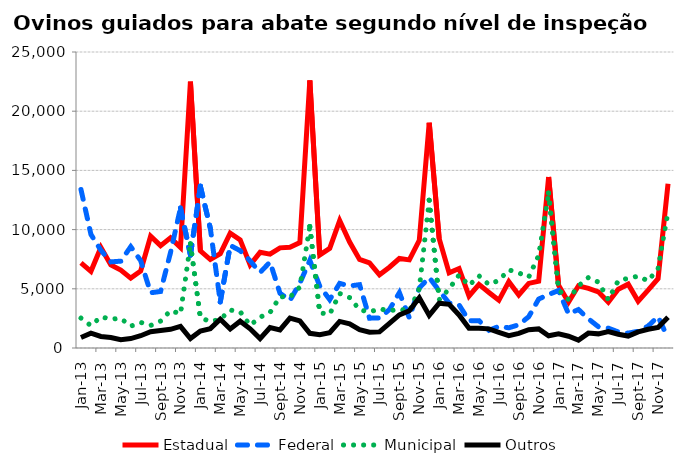
| Category | Estadual | Federal | Municipal | Outros |
|---|---|---|---|---|
| 2013-01-01 | 7184 | 13390 | 2529 | 890 |
| 2013-02-01 | 6476 | 9593 | 1889 | 1252 |
| 2013-03-01 | 8493 | 8261 | 2633 | 978 |
| 2013-04-01 | 7014 | 7273 | 2441 | 892 |
| 2013-05-01 | 6576 | 7335 | 2502 | 700 |
| 2013-06-01 | 5902 | 8555 | 1839 | 796 |
| 2013-07-01 | 6508 | 7380 | 2164 | 1036 |
| 2013-08-01 | 9440 | 4661 | 1903 | 1374 |
| 2013-09-01 | 8647 | 4775 | 2274 | 1475 |
| 2013-10-01 | 9303 | 8063 | 3164 | 1575 |
| 2013-11-01 | 8496 | 11823 | 2880 | 1831 |
| 2013-12-01 | 22506 | 7849 | 8800 | 800 |
| 2014-01-01 | 8208 | 13667 | 2560 | 1438 |
| 2014-02-01 | 7473 | 10109 | 2230 | 1631 |
| 2014-03-01 | 7964 | 3888 | 2426 | 2427 |
| 2014-04-01 | 9704 | 8668 | 3202 | 1611 |
| 2014-05-01 | 9137 | 8220 | 3061 | 2260 |
| 2014-06-01 | 7024 | 7359 | 1918 | 1622 |
| 2014-07-01 | 8079 | 6379 | 2601 | 797 |
| 2014-08-01 | 7920 | 7259 | 3000 | 1733 |
| 2014-09-01 | 8459 | 4626 | 4334 | 1525 |
| 2014-10-01 | 8514 | 4018 | 4295 | 2531 |
| 2014-11-01 | 8910 | 5478 | 5153 | 2283 |
| 2014-12-01 | 22595 | 7406 | 10265 | 1241 |
| 2015-01-01 | 7862 | 5220 | 2960 | 1123 |
| 2015-02-01 | 8423 | 4083 | 2860 | 1289 |
| 2015-03-01 | 10763 | 5457 | 4605 | 2244 |
| 2015-04-01 | 8946 | 5240 | 4257 | 2046 |
| 2015-05-01 | 7475 | 5349 | 3230 | 1552 |
| 2015-06-01 | 7196 | 2520 | 3038 | 1337 |
| 2015-07-01 | 6179 | 2538 | 3315 | 1360 |
| 2015-08-01 | 6822 | 3247 | 3138 | 2082 |
| 2015-09-01 | 7559 | 4671 | 3292 | 2802 |
| 2015-10-01 | 7444 | 2551 | 3108 | 3150 |
| 2015-11-01 | 9088 | 5066 | 5002 | 4251 |
| 2015-12-01 | 19031 | 5954 | 12485 | 2757 |
| 2016-01-01 | 9236 | 4841 | 4071 | 3786 |
| 2016-02-01 | 6346 | 3793 | 4991 | 3694 |
| 2016-03-01 | 6711 | 3637 | 6164 | 2794 |
| 2016-04-01 | 4392 | 2300 | 5281 | 1664 |
| 2016-05-01 | 5372 | 2311 | 6097 | 1663 |
| 2016-06-01 | 4689 | 1497 | 5357 | 1615 |
| 2016-07-01 | 4028 | 1825 | 5714 | 1327 |
| 2016-08-01 | 5604 | 1708 | 6600 | 1045 |
| 2016-09-01 | 4480 | 1962 | 6342 | 1232 |
| 2016-10-01 | 5455 | 2643 | 5984 | 1545 |
| 2016-11-01 | 5636 | 4131 | 7823 | 1613 |
| 2016-12-01 | 14442 | 4519 | 13085 | 1035 |
| 2017-01-01 | 5294 | 4855 | 4920 | 1198 |
| 2017-02-01 | 3872 | 2885 | 4094 | 997 |
| 2017-03-01 | 5255 | 3248 | 5249 | 668 |
| 2017-04-01 | 5033 | 2459 | 5953 | 1258 |
| 2017-05-01 | 4742 | 1798 | 5564 | 1194 |
| 2017-06-01 | 3878 | 1677 | 4087 | 1396 |
| 2017-07-01 | 4958 | 1356 | 5688 | 1162 |
| 2017-08-01 | 5392 | 1255 | 5888 | 1010 |
| 2017-09-01 | 3954 | 1417 | 6066 | 1361 |
| 2017-10-01 | 4885 | 1850 | 5664 | 1578 |
| 2017-11-01 | 5861 | 2653 | 6728 | 1732 |
| 2017-12-01 | 13879 | 814 | 11469 | 2596 |